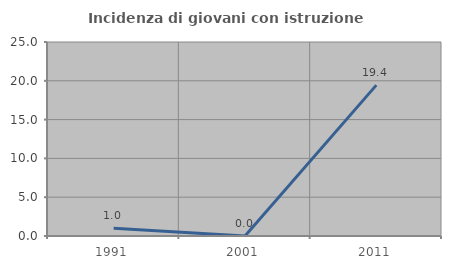
| Category | Incidenza di giovani con istruzione universitaria |
|---|---|
| 1991.0 | 0.99 |
| 2001.0 | 0 |
| 2011.0 | 19.444 |